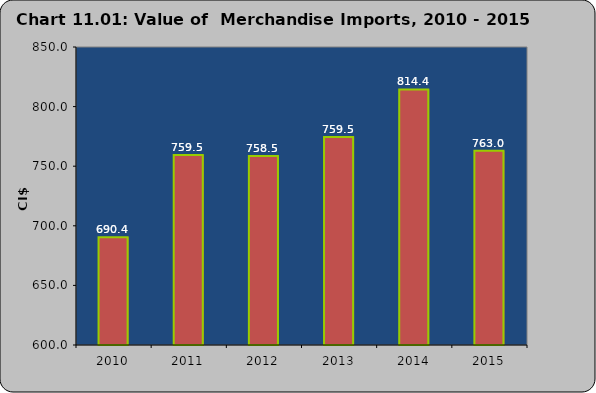
| Category | Series 0 |
|---|---|
| 2010 | 690.388 |
| 2011 | 759.5 |
| 2012 | 758.5 |
| 2013 | 774.5 |
| 2014 | 814.359 |
| 2015 | 762.955 |